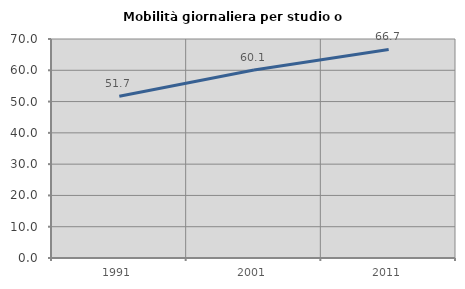
| Category | Mobilità giornaliera per studio o lavoro |
|---|---|
| 1991.0 | 51.709 |
| 2001.0 | 60.102 |
| 2011.0 | 66.667 |